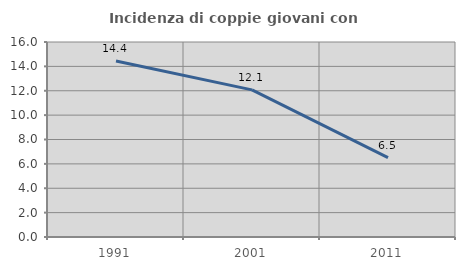
| Category | Incidenza di coppie giovani con figli |
|---|---|
| 1991.0 | 14.437 |
| 2001.0 | 12.074 |
| 2011.0 | 6.509 |